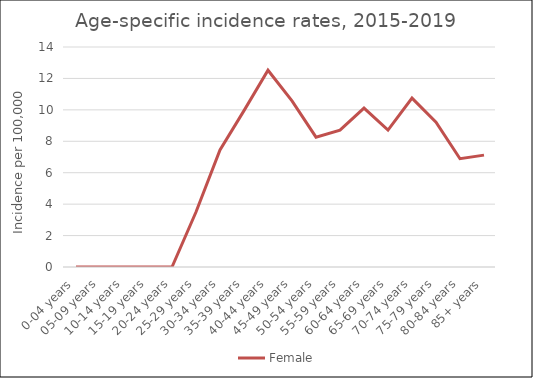
| Category | Female |
|---|---|
| 0-04 years | 0 |
| 05-09 years | 0 |
| 10-14 years | 0 |
| 15-19 years | 0 |
| 20-24 years | 0 |
| 25-29 years | 3.5 |
| 30-34 years | 7.45 |
| 35-39 years | 9.95 |
| 40-44 years | 12.52 |
| 45-49 years | 10.57 |
| 50-54 years | 8.26 |
| 55-59 years | 8.71 |
| 60-64 years | 10.11 |
| 65-69 years | 8.71 |
| 70-74 years | 10.75 |
| 75-79 years | 9.22 |
| 80-84 years | 6.89 |
| 85+ years | 7.12 |